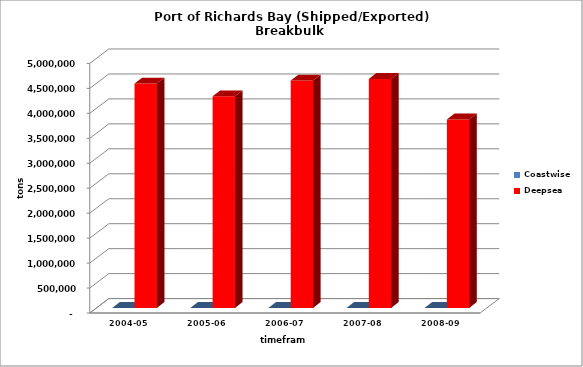
| Category | Coastwise | Deepsea |
|---|---|---|
| 2004-05 | 4 | 4497209 |
| 2005-06 | 0 | 4239229 |
| 2006-07 | 0 | 4556244 |
| 2007-08 | 0 | 4588162 |
| 2008-09 | 0 | 3776379 |